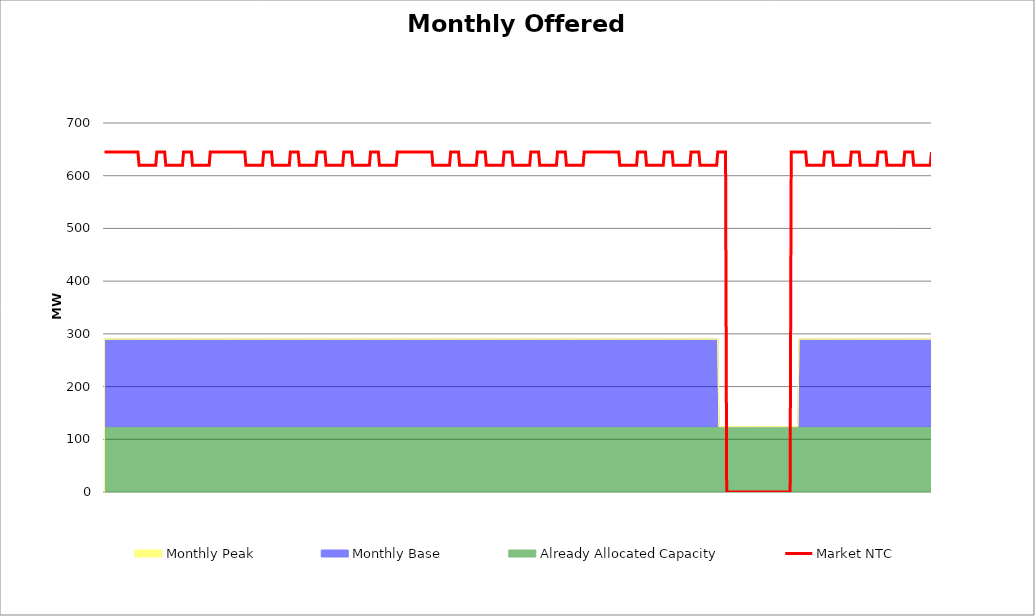
| Category | Market NTC |
|---|---|
| 0 | 645 |
| 1 | 645 |
| 2 | 645 |
| 3 | 645 |
| 4 | 645 |
| 5 | 645 |
| 6 | 645 |
| 7 | 645 |
| 8 | 645 |
| 9 | 645 |
| 10 | 645 |
| 11 | 645 |
| 12 | 645 |
| 13 | 645 |
| 14 | 645 |
| 15 | 645 |
| 16 | 645 |
| 17 | 645 |
| 18 | 645 |
| 19 | 645 |
| 20 | 645 |
| 21 | 645 |
| 22 | 645 |
| 23 | 645 |
| 24 | 645 |
| 25 | 645 |
| 26 | 645 |
| 27 | 645 |
| 28 | 645 |
| 29 | 645 |
| 30 | 645 |
| 31 | 620 |
| 32 | 620 |
| 33 | 620 |
| 34 | 620 |
| 35 | 620 |
| 36 | 620 |
| 37 | 620 |
| 38 | 620 |
| 39 | 620 |
| 40 | 620 |
| 41 | 620 |
| 42 | 620 |
| 43 | 620 |
| 44 | 620 |
| 45 | 620 |
| 46 | 620 |
| 47 | 645 |
| 48 | 645 |
| 49 | 645 |
| 50 | 645 |
| 51 | 645 |
| 52 | 645 |
| 53 | 645 |
| 54 | 645 |
| 55 | 620 |
| 56 | 620 |
| 57 | 620 |
| 58 | 620 |
| 59 | 620 |
| 60 | 620 |
| 61 | 620 |
| 62 | 620 |
| 63 | 620 |
| 64 | 620 |
| 65 | 620 |
| 66 | 620 |
| 67 | 620 |
| 68 | 620 |
| 69 | 620 |
| 70 | 620 |
| 71 | 645 |
| 72 | 645 |
| 73 | 645 |
| 74 | 645 |
| 75 | 645 |
| 76 | 645 |
| 77 | 645 |
| 78 | 645 |
| 79 | 620 |
| 80 | 620 |
| 81 | 620 |
| 82 | 620 |
| 83 | 620 |
| 84 | 620 |
| 85 | 620 |
| 86 | 620 |
| 87 | 620 |
| 88 | 620 |
| 89 | 620 |
| 90 | 620 |
| 91 | 620 |
| 92 | 620 |
| 93 | 620 |
| 94 | 620 |
| 95 | 645 |
| 96 | 645 |
| 97 | 645 |
| 98 | 645 |
| 99 | 645 |
| 100 | 645 |
| 101 | 645 |
| 102 | 645 |
| 103 | 645 |
| 104 | 645 |
| 105 | 645 |
| 106 | 645 |
| 107 | 645 |
| 108 | 645 |
| 109 | 645 |
| 110 | 645 |
| 111 | 645 |
| 112 | 645 |
| 113 | 645 |
| 114 | 645 |
| 115 | 645 |
| 116 | 645 |
| 117 | 645 |
| 118 | 645 |
| 119 | 645 |
| 120 | 645 |
| 121 | 645 |
| 122 | 645 |
| 123 | 645 |
| 124 | 645 |
| 125 | 645 |
| 126 | 645 |
| 127 | 620 |
| 128 | 620 |
| 129 | 620 |
| 130 | 620 |
| 131 | 620 |
| 132 | 620 |
| 133 | 620 |
| 134 | 620 |
| 135 | 620 |
| 136 | 620 |
| 137 | 620 |
| 138 | 620 |
| 139 | 620 |
| 140 | 620 |
| 141 | 620 |
| 142 | 620 |
| 143 | 645 |
| 144 | 645 |
| 145 | 645 |
| 146 | 645 |
| 147 | 645 |
| 148 | 645 |
| 149 | 645 |
| 150 | 645 |
| 151 | 620 |
| 152 | 620 |
| 153 | 620 |
| 154 | 620 |
| 155 | 620 |
| 156 | 620 |
| 157 | 620 |
| 158 | 620 |
| 159 | 620 |
| 160 | 620 |
| 161 | 620 |
| 162 | 620 |
| 163 | 620 |
| 164 | 620 |
| 165 | 620 |
| 166 | 620 |
| 167 | 645 |
| 168 | 645 |
| 169 | 645 |
| 170 | 645 |
| 171 | 645 |
| 172 | 645 |
| 173 | 645 |
| 174 | 645 |
| 175 | 620 |
| 176 | 620 |
| 177 | 620 |
| 178 | 620 |
| 179 | 620 |
| 180 | 620 |
| 181 | 620 |
| 182 | 620 |
| 183 | 620 |
| 184 | 620 |
| 185 | 620 |
| 186 | 620 |
| 187 | 620 |
| 188 | 620 |
| 189 | 620 |
| 190 | 620 |
| 191 | 645 |
| 192 | 645 |
| 193 | 645 |
| 194 | 645 |
| 195 | 645 |
| 196 | 645 |
| 197 | 645 |
| 198 | 645 |
| 199 | 620 |
| 200 | 620 |
| 201 | 620 |
| 202 | 620 |
| 203 | 620 |
| 204 | 620 |
| 205 | 620 |
| 206 | 620 |
| 207 | 620 |
| 208 | 620 |
| 209 | 620 |
| 210 | 620 |
| 211 | 620 |
| 212 | 620 |
| 213 | 620 |
| 214 | 620 |
| 215 | 645 |
| 216 | 645 |
| 217 | 645 |
| 218 | 645 |
| 219 | 645 |
| 220 | 645 |
| 221 | 645 |
| 222 | 645 |
| 223 | 620 |
| 224 | 620 |
| 225 | 620 |
| 226 | 620 |
| 227 | 620 |
| 228 | 620 |
| 229 | 620 |
| 230 | 620 |
| 231 | 620 |
| 232 | 620 |
| 233 | 620 |
| 234 | 620 |
| 235 | 620 |
| 236 | 620 |
| 237 | 620 |
| 238 | 620 |
| 239 | 645 |
| 240 | 645 |
| 241 | 645 |
| 242 | 645 |
| 243 | 645 |
| 244 | 645 |
| 245 | 645 |
| 246 | 645 |
| 247 | 620 |
| 248 | 620 |
| 249 | 620 |
| 250 | 620 |
| 251 | 620 |
| 252 | 620 |
| 253 | 620 |
| 254 | 620 |
| 255 | 620 |
| 256 | 620 |
| 257 | 620 |
| 258 | 620 |
| 259 | 620 |
| 260 | 620 |
| 261 | 620 |
| 262 | 620 |
| 263 | 645 |
| 264 | 645 |
| 265 | 645 |
| 266 | 645 |
| 267 | 645 |
| 268 | 645 |
| 269 | 645 |
| 270 | 645 |
| 271 | 645 |
| 272 | 645 |
| 273 | 645 |
| 274 | 645 |
| 275 | 645 |
| 276 | 645 |
| 277 | 645 |
| 278 | 645 |
| 279 | 645 |
| 280 | 645 |
| 281 | 645 |
| 282 | 645 |
| 283 | 645 |
| 284 | 645 |
| 285 | 645 |
| 286 | 645 |
| 287 | 645 |
| 288 | 645 |
| 289 | 645 |
| 290 | 645 |
| 291 | 645 |
| 292 | 645 |
| 293 | 645 |
| 294 | 645 |
| 295 | 620 |
| 296 | 620 |
| 297 | 620 |
| 298 | 620 |
| 299 | 620 |
| 300 | 620 |
| 301 | 620 |
| 302 | 620 |
| 303 | 620 |
| 304 | 620 |
| 305 | 620 |
| 306 | 620 |
| 307 | 620 |
| 308 | 620 |
| 309 | 620 |
| 310 | 620 |
| 311 | 645 |
| 312 | 645 |
| 313 | 645 |
| 314 | 645 |
| 315 | 645 |
| 316 | 645 |
| 317 | 645 |
| 318 | 645 |
| 319 | 620 |
| 320 | 620 |
| 321 | 620 |
| 322 | 620 |
| 323 | 620 |
| 324 | 620 |
| 325 | 620 |
| 326 | 620 |
| 327 | 620 |
| 328 | 620 |
| 329 | 620 |
| 330 | 620 |
| 331 | 620 |
| 332 | 620 |
| 333 | 620 |
| 334 | 620 |
| 335 | 645 |
| 336 | 645 |
| 337 | 645 |
| 338 | 645 |
| 339 | 645 |
| 340 | 645 |
| 341 | 645 |
| 342 | 645 |
| 343 | 620 |
| 344 | 620 |
| 345 | 620 |
| 346 | 620 |
| 347 | 620 |
| 348 | 620 |
| 349 | 620 |
| 350 | 620 |
| 351 | 620 |
| 352 | 620 |
| 353 | 620 |
| 354 | 620 |
| 355 | 620 |
| 356 | 620 |
| 357 | 620 |
| 358 | 620 |
| 359 | 645 |
| 360 | 645 |
| 361 | 645 |
| 362 | 645 |
| 363 | 645 |
| 364 | 645 |
| 365 | 645 |
| 366 | 645 |
| 367 | 620 |
| 368 | 620 |
| 369 | 620 |
| 370 | 620 |
| 371 | 620 |
| 372 | 620 |
| 373 | 620 |
| 374 | 620 |
| 375 | 620 |
| 376 | 620 |
| 377 | 620 |
| 378 | 620 |
| 379 | 620 |
| 380 | 620 |
| 381 | 620 |
| 382 | 620 |
| 383 | 645 |
| 384 | 645 |
| 385 | 645 |
| 386 | 645 |
| 387 | 645 |
| 388 | 645 |
| 389 | 645 |
| 390 | 645 |
| 391 | 620 |
| 392 | 620 |
| 393 | 620 |
| 394 | 620 |
| 395 | 620 |
| 396 | 620 |
| 397 | 620 |
| 398 | 620 |
| 399 | 620 |
| 400 | 620 |
| 401 | 620 |
| 402 | 620 |
| 403 | 620 |
| 404 | 620 |
| 405 | 620 |
| 406 | 620 |
| 407 | 645 |
| 408 | 645 |
| 409 | 645 |
| 410 | 645 |
| 411 | 645 |
| 412 | 645 |
| 413 | 645 |
| 414 | 645 |
| 415 | 620 |
| 416 | 620 |
| 417 | 620 |
| 418 | 620 |
| 419 | 620 |
| 420 | 620 |
| 421 | 620 |
| 422 | 620 |
| 423 | 620 |
| 424 | 620 |
| 425 | 620 |
| 426 | 620 |
| 427 | 620 |
| 428 | 620 |
| 429 | 620 |
| 430 | 620 |
| 431 | 645 |
| 432 | 645 |
| 433 | 645 |
| 434 | 645 |
| 435 | 645 |
| 436 | 645 |
| 437 | 645 |
| 438 | 645 |
| 439 | 645 |
| 440 | 645 |
| 441 | 645 |
| 442 | 645 |
| 443 | 645 |
| 444 | 645 |
| 445 | 645 |
| 446 | 645 |
| 447 | 645 |
| 448 | 645 |
| 449 | 645 |
| 450 | 645 |
| 451 | 645 |
| 452 | 645 |
| 453 | 645 |
| 454 | 645 |
| 455 | 645 |
| 456 | 645 |
| 457 | 645 |
| 458 | 645 |
| 459 | 645 |
| 460 | 645 |
| 461 | 645 |
| 462 | 645 |
| 463 | 620 |
| 464 | 620 |
| 465 | 620 |
| 466 | 620 |
| 467 | 620 |
| 468 | 620 |
| 469 | 620 |
| 470 | 620 |
| 471 | 620 |
| 472 | 620 |
| 473 | 620 |
| 474 | 620 |
| 475 | 620 |
| 476 | 620 |
| 477 | 620 |
| 478 | 620 |
| 479 | 645 |
| 480 | 645 |
| 481 | 645 |
| 482 | 645 |
| 483 | 645 |
| 484 | 645 |
| 485 | 645 |
| 486 | 645 |
| 487 | 620 |
| 488 | 620 |
| 489 | 620 |
| 490 | 620 |
| 491 | 620 |
| 492 | 620 |
| 493 | 620 |
| 494 | 620 |
| 495 | 620 |
| 496 | 620 |
| 497 | 620 |
| 498 | 620 |
| 499 | 620 |
| 500 | 620 |
| 501 | 620 |
| 502 | 620 |
| 503 | 645 |
| 504 | 645 |
| 505 | 645 |
| 506 | 645 |
| 507 | 645 |
| 508 | 645 |
| 509 | 645 |
| 510 | 645 |
| 511 | 620 |
| 512 | 620 |
| 513 | 620 |
| 514 | 620 |
| 515 | 620 |
| 516 | 620 |
| 517 | 620 |
| 518 | 620 |
| 519 | 620 |
| 520 | 620 |
| 521 | 620 |
| 522 | 620 |
| 523 | 620 |
| 524 | 620 |
| 525 | 620 |
| 526 | 620 |
| 527 | 645 |
| 528 | 645 |
| 529 | 645 |
| 530 | 645 |
| 531 | 645 |
| 532 | 645 |
| 533 | 645 |
| 534 | 645 |
| 535 | 620 |
| 536 | 620 |
| 537 | 620 |
| 538 | 620 |
| 539 | 620 |
| 540 | 620 |
| 541 | 620 |
| 542 | 620 |
| 543 | 620 |
| 544 | 620 |
| 545 | 620 |
| 546 | 620 |
| 547 | 620 |
| 548 | 620 |
| 549 | 620 |
| 550 | 620 |
| 551 | 645 |
| 552 | 645 |
| 553 | 645 |
| 554 | 645 |
| 555 | 645 |
| 556 | 645 |
| 557 | 645 |
| 558 | 645 |
| 559 | 0 |
| 560 | 0 |
| 561 | 0 |
| 562 | 0 |
| 563 | 0 |
| 564 | 0 |
| 565 | 0 |
| 566 | 0 |
| 567 | 0 |
| 568 | 0 |
| 569 | 0 |
| 570 | 0 |
| 571 | 0 |
| 572 | 0 |
| 573 | 0 |
| 574 | 0 |
| 575 | 0 |
| 576 | 0 |
| 577 | 0 |
| 578 | 0 |
| 579 | 0 |
| 580 | 0 |
| 581 | 0 |
| 582 | 0 |
| 583 | 0 |
| 584 | 0 |
| 585 | 0 |
| 586 | 0 |
| 587 | 0 |
| 588 | 0 |
| 589 | 0 |
| 590 | 0 |
| 591 | 0 |
| 592 | 0 |
| 593 | 0 |
| 594 | 0 |
| 595 | 0 |
| 596 | 0 |
| 597 | 0 |
| 598 | 0 |
| 599 | 0 |
| 600 | 0 |
| 601 | 0 |
| 602 | 0 |
| 603 | 0 |
| 604 | 0 |
| 605 | 0 |
| 606 | 0 |
| 607 | 0 |
| 608 | 0 |
| 609 | 0 |
| 610 | 0 |
| 611 | 0 |
| 612 | 0 |
| 613 | 0 |
| 614 | 0 |
| 615 | 0 |
| 616 | 0 |
| 617 | 645 |
| 618 | 645 |
| 619 | 645 |
| 620 | 645 |
| 621 | 645 |
| 622 | 645 |
| 623 | 645 |
| 624 | 645 |
| 625 | 645 |
| 626 | 645 |
| 627 | 645 |
| 628 | 645 |
| 629 | 645 |
| 630 | 645 |
| 631 | 620 |
| 632 | 620 |
| 633 | 620 |
| 634 | 620 |
| 635 | 620 |
| 636 | 620 |
| 637 | 620 |
| 638 | 620 |
| 639 | 620 |
| 640 | 620 |
| 641 | 620 |
| 642 | 620 |
| 643 | 620 |
| 644 | 620 |
| 645 | 620 |
| 646 | 620 |
| 647 | 645 |
| 648 | 645 |
| 649 | 645 |
| 650 | 645 |
| 651 | 645 |
| 652 | 645 |
| 653 | 645 |
| 654 | 645 |
| 655 | 620 |
| 656 | 620 |
| 657 | 620 |
| 658 | 620 |
| 659 | 620 |
| 660 | 620 |
| 661 | 620 |
| 662 | 620 |
| 663 | 620 |
| 664 | 620 |
| 665 | 620 |
| 666 | 620 |
| 667 | 620 |
| 668 | 620 |
| 669 | 620 |
| 670 | 620 |
| 671 | 645 |
| 672 | 645 |
| 673 | 645 |
| 674 | 645 |
| 675 | 645 |
| 676 | 645 |
| 677 | 645 |
| 678 | 645 |
| 679 | 620 |
| 680 | 620 |
| 681 | 620 |
| 682 | 620 |
| 683 | 620 |
| 684 | 620 |
| 685 | 620 |
| 686 | 620 |
| 687 | 620 |
| 688 | 620 |
| 689 | 620 |
| 690 | 620 |
| 691 | 620 |
| 692 | 620 |
| 693 | 620 |
| 694 | 620 |
| 695 | 645 |
| 696 | 645 |
| 697 | 645 |
| 698 | 645 |
| 699 | 645 |
| 700 | 645 |
| 701 | 645 |
| 702 | 645 |
| 703 | 620 |
| 704 | 620 |
| 705 | 620 |
| 706 | 620 |
| 707 | 620 |
| 708 | 620 |
| 709 | 620 |
| 710 | 620 |
| 711 | 620 |
| 712 | 620 |
| 713 | 620 |
| 714 | 620 |
| 715 | 620 |
| 716 | 620 |
| 717 | 620 |
| 718 | 620 |
| 719 | 645 |
| 720 | 645 |
| 721 | 645 |
| 722 | 645 |
| 723 | 645 |
| 724 | 645 |
| 725 | 645 |
| 726 | 645 |
| 727 | 620 |
| 728 | 620 |
| 729 | 620 |
| 730 | 620 |
| 731 | 620 |
| 732 | 620 |
| 733 | 620 |
| 734 | 620 |
| 735 | 620 |
| 736 | 620 |
| 737 | 620 |
| 738 | 620 |
| 739 | 620 |
| 740 | 620 |
| 741 | 620 |
| 742 | 620 |
| 743 | 645 |